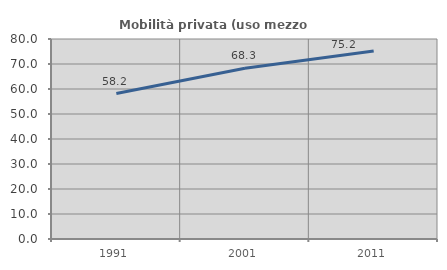
| Category | Mobilità privata (uso mezzo privato) |
|---|---|
| 1991.0 | 58.186 |
| 2001.0 | 68.307 |
| 2011.0 | 75.172 |